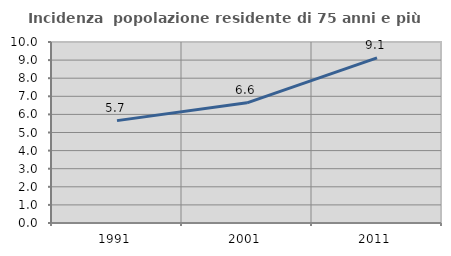
| Category | Incidenza  popolazione residente di 75 anni e più |
|---|---|
| 1991.0 | 5.656 |
| 2001.0 | 6.641 |
| 2011.0 | 9.119 |